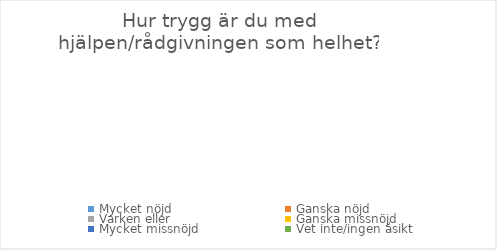
| Category | Series 0 |
|---|---|
| Mycket nöjd  | 0 |
| Ganska nöjd | 0 |
| Varken eller  | 0 |
| Ganska missnöjd | 0 |
| Mycket missnöjd  | 0 |
| Vet inte/ingen åsikt | 0 |